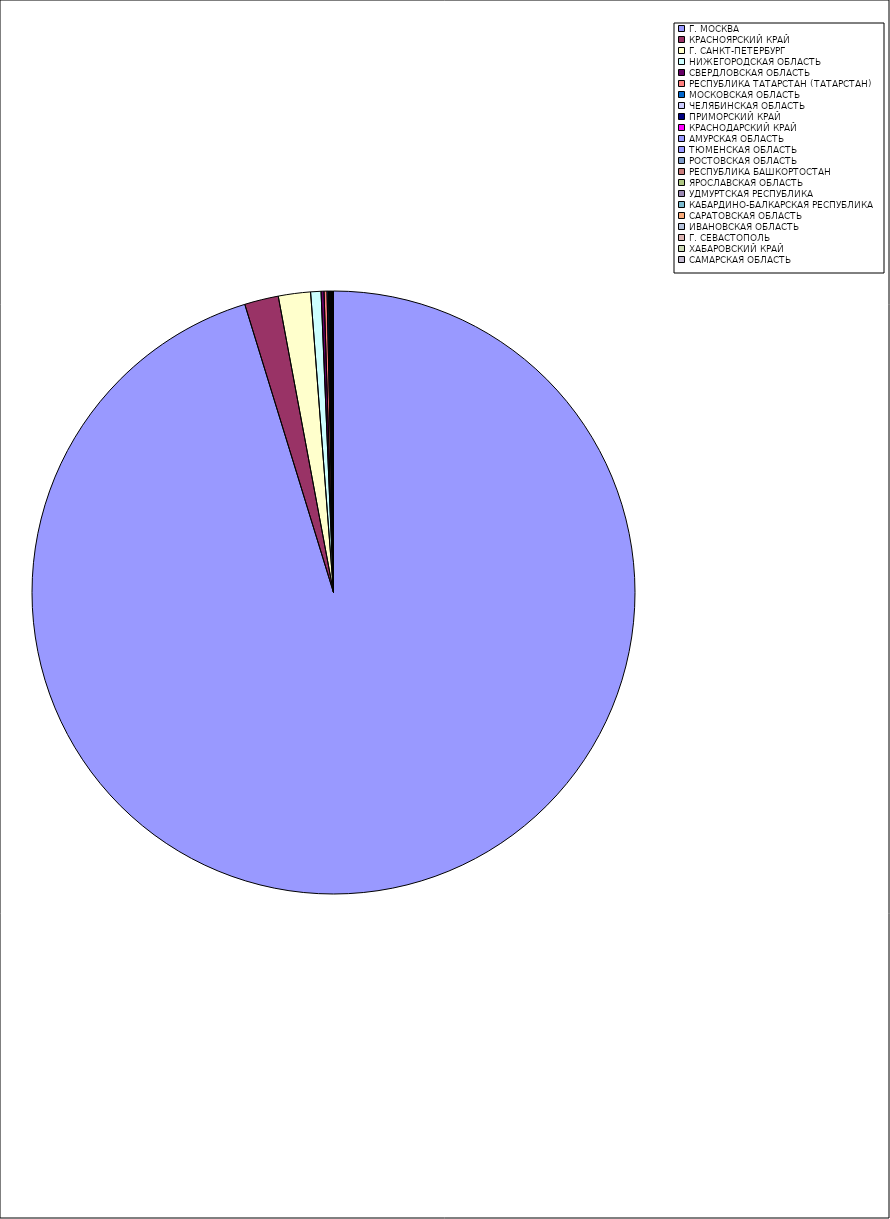
| Category | Оборот |
|---|---|
| Г. МОСКВА | 95.186 |
| КРАСНОЯРСКИЙ КРАЙ | 1.816 |
| Г. САНКТ-ПЕТЕРБУРГ | 1.721 |
| НИЖЕГОРОДСКАЯ ОБЛАСТЬ | 0.554 |
| СВЕРДЛОВСКАЯ ОБЛАСТЬ | 0.159 |
| РЕСПУБЛИКА ТАТАРСТАН (ТАТАРСТАН) | 0.157 |
| МОСКОВСКАЯ ОБЛАСТЬ | 0.076 |
| ЧЕЛЯБИНСКАЯ ОБЛАСТЬ | 0.05 |
| ПРИМОРСКИЙ КРАЙ | 0.039 |
| КРАСНОДАРСКИЙ КРАЙ | 0.035 |
| АМУРСКАЯ ОБЛАСТЬ | 0.031 |
| ТЮМЕНСКАЯ ОБЛАСТЬ | 0.014 |
| РОСТОВСКАЯ ОБЛАСТЬ | 0.014 |
| РЕСПУБЛИКА БАШКОРТОСТАН | 0.013 |
| ЯРОСЛАВСКАЯ ОБЛАСТЬ | 0.011 |
| УДМУРТСКАЯ РЕСПУБЛИКА | 0.01 |
| КАБАРДИНО-БАЛКАРСКАЯ РЕСПУБЛИКА | 0.01 |
| САРАТОВСКАЯ ОБЛАСТЬ | 0.009 |
| ИВАНОВСКАЯ ОБЛАСТЬ | 0.008 |
| Г. СЕВАСТОПОЛЬ | 0.008 |
| ХАБАРОВСКИЙ КРАЙ | 0.008 |
| САМАРСКАЯ ОБЛАСТЬ | 0.007 |